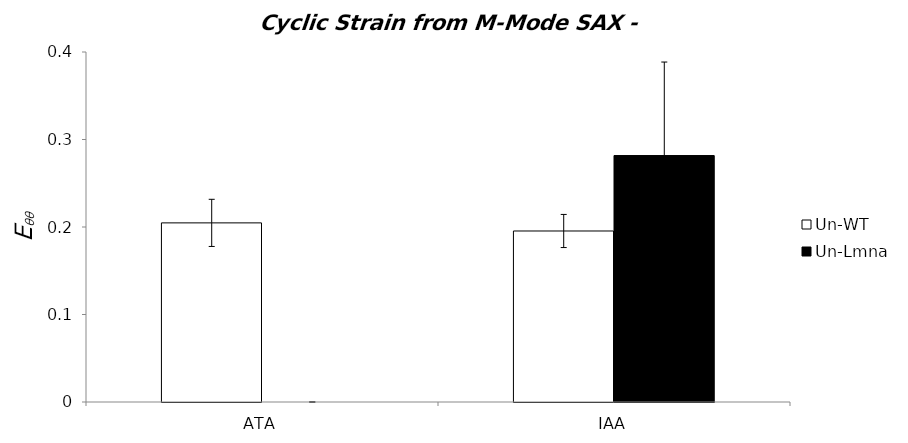
| Category | Un-WT | Un-Lmna |
|---|---|---|
| 0 | 0.205 | 0 |
| 1 | 0.195 | 0.282 |